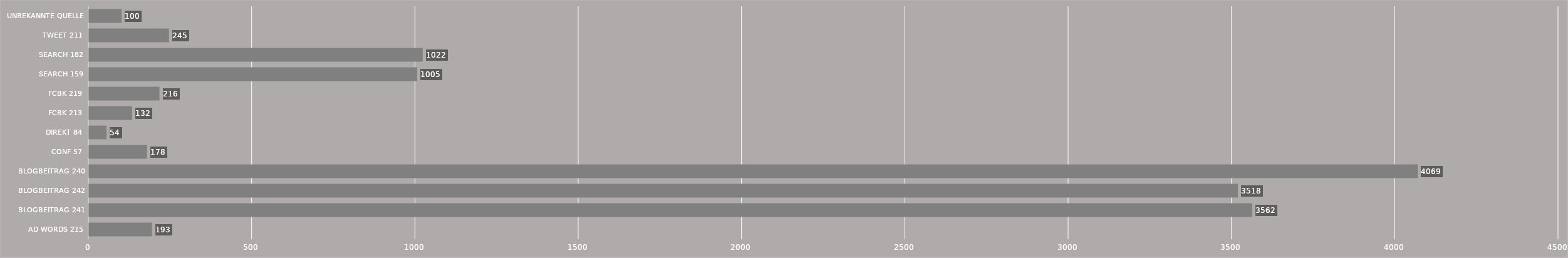
| Category | Series 0 |
|---|---|
| AD WORDS 215 | 193 |
| BLOGBEITRAG 241 | 3562 |
| BLOGBEITRAG 242 | 3518 |
| BLOGBEITRAG 240 | 4069 |
| CONF 57 | 178 |
| DIREKT 84 | 54 |
| FCBK 213 | 132 |
| FCBK 219 | 216 |
| SEARCH 159 | 1005 |
| SEARCH 182 | 1022 |
| TWEET 211 | 245 |
| UNBEKANNTE QUELLE | 100 |